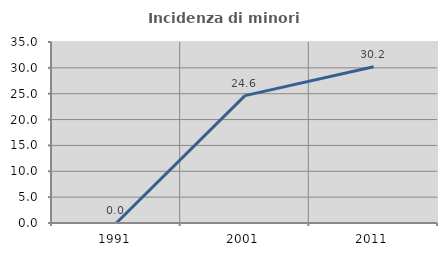
| Category | Incidenza di minori stranieri |
|---|---|
| 1991.0 | 0 |
| 2001.0 | 24.627 |
| 2011.0 | 30.213 |